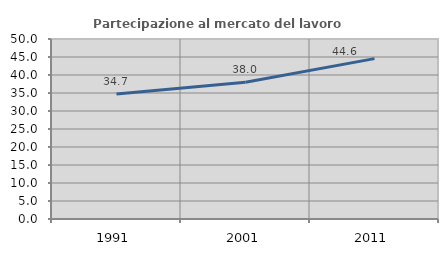
| Category | Partecipazione al mercato del lavoro  femminile |
|---|---|
| 1991.0 | 34.692 |
| 2001.0 | 37.999 |
| 2011.0 | 44.555 |